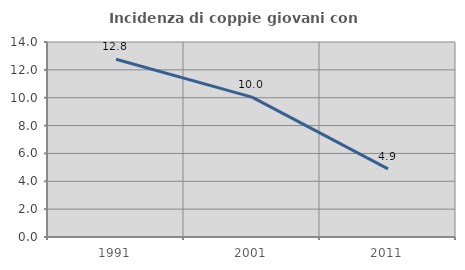
| Category | Incidenza di coppie giovani con figli |
|---|---|
| 1991.0 | 12.766 |
| 2001.0 | 10.042 |
| 2011.0 | 4.889 |